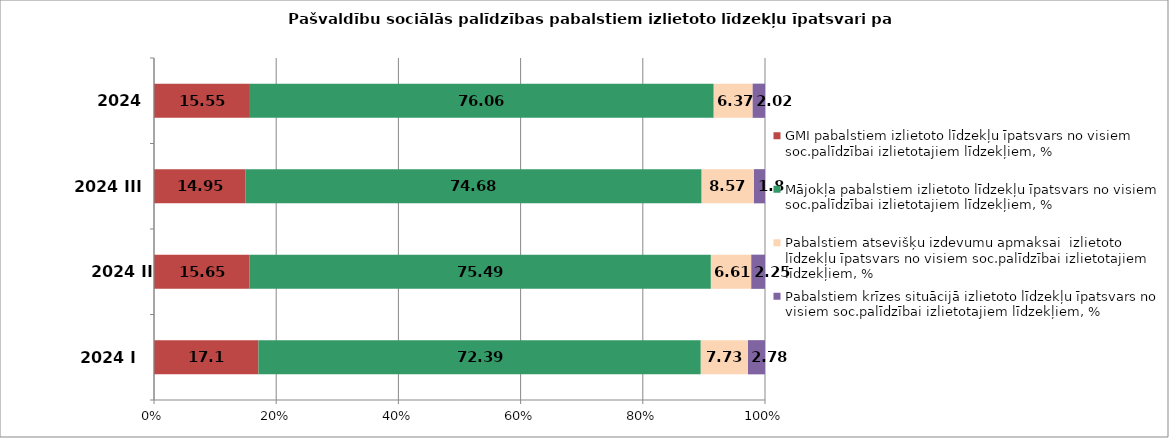
| Category | GMI pabalstiem izlietoto līdzekļu īpatsvars no visiem soc.palīdzībai izlietotajiem līdzekļiem, % | Mājokļa pabalstiem izlietoto līdzekļu īpatsvars no visiem soc.palīdzībai izlietotajiem līdzekļiem, % | Pabalstiem atsevišķu izdevumu apmaksai  izlietoto līdzekļu īpatsvars no visiem soc.palīdzībai izlietotajiem līdzekļiem, % | Pabalstiem krīzes situācijā izlietoto līdzekļu īpatsvars no visiem soc.palīdzībai izlietotajiem līdzekļiem, % |
|---|---|---|---|---|
| 2024 I | 17.1 | 72.39 | 7.73 | 2.78 |
| 2024 II | 15.65 | 75.49 | 6.61 | 2.25 |
| 2024 III | 14.95 | 74.68 | 8.57 | 1.8 |
| 2024 IV | 15.55 | 76.06 | 6.37 | 2.02 |